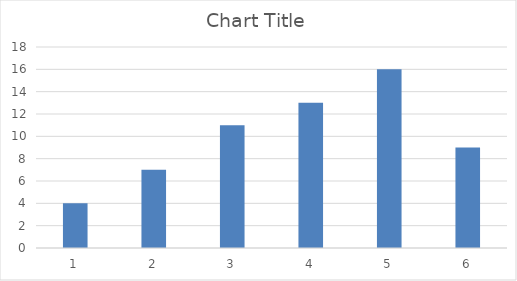
| Category | Series 0 |
|---|---|
| 0 | 4 |
| 1 | 7 |
| 2 | 11 |
| 3 | 13 |
| 4 | 16 |
| 5 | 9 |